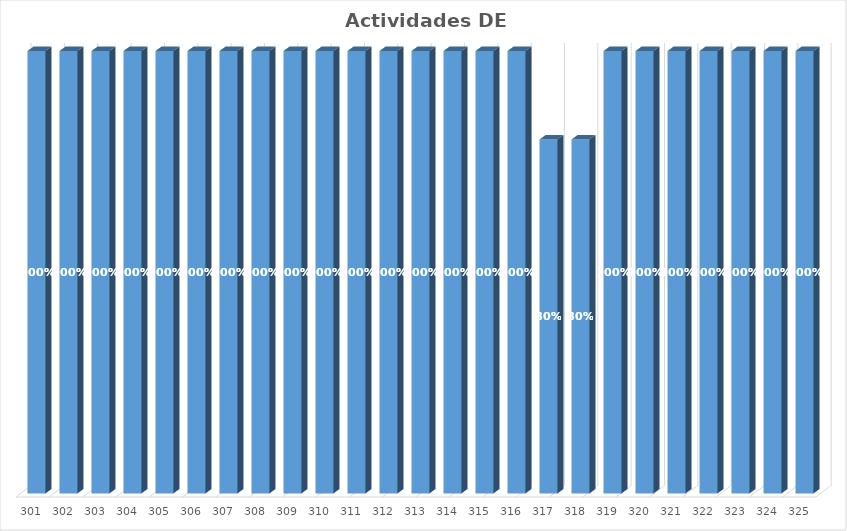
| Category | % Avance |
|---|---|
| 301.0 | 1 |
| 302.0 | 1 |
| 303.0 | 1 |
| 304.0 | 1 |
| 305.0 | 1 |
| 306.0 | 1 |
| 307.0 | 1 |
| 308.0 | 1 |
| 309.0 | 1 |
| 310.0 | 1 |
| 311.0 | 1 |
| 312.0 | 1 |
| 313.0 | 1 |
| 314.0 | 1 |
| 315.0 | 1 |
| 316.0 | 1 |
| 317.0 | 0.8 |
| 318.0 | 0.8 |
| 319.0 | 1 |
| 320.0 | 1 |
| 321.0 | 1 |
| 322.0 | 1 |
| 323.0 | 1 |
| 324.0 | 1 |
| 325.0 | 1 |